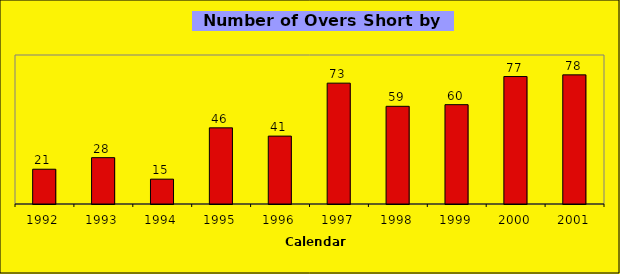
| Category | Series 0 |
|---|---|
| 1992.0 | 21 |
| 1993.0 | 28 |
| 1994.0 | 15 |
| 1995.0 | 46 |
| 1996.0 | 41 |
| 1997.0 | 73 |
| 1998.0 | 59 |
| 1999.0 | 60 |
| 2000.0 | 77 |
| 2001.0 | 78 |